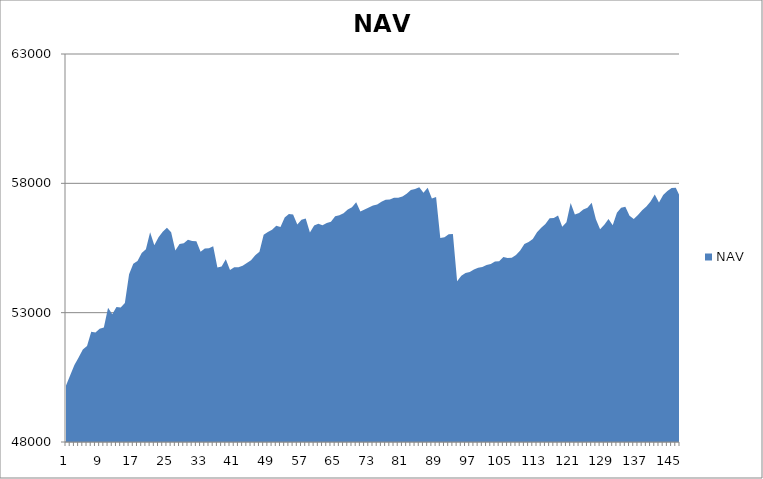
| Category | NAV |
|---|---|
| 0 | 50185.185 |
| 1 | 50585.185 |
| 2 | 50973.977 |
| 3 | 51265.977 |
| 4 | 51576.741 |
| 5 | 51711.523 |
| 6 | 52262.893 |
| 7 | 52230.24 |
| 8 | 52381.556 |
| 9 | 52425.915 |
| 10 | 53192.581 |
| 11 | 52939.146 |
| 12 | 53220.069 |
| 13 | 53197.341 |
| 14 | 53369.61 |
| 15 | 54480.721 |
| 16 | 54888.365 |
| 17 | 55001.902 |
| 18 | 55308.308 |
| 19 | 55448.308 |
| 20 | 56110.305 |
| 21 | 55610.305 |
| 22 | 55916.954 |
| 23 | 56129.798 |
| 24 | 56279.798 |
| 25 | 56105.301 |
| 26 | 55401.645 |
| 27 | 55657.201 |
| 28 | 55686.925 |
| 29 | 55823.001 |
| 30 | 55769.596 |
| 31 | 55759.375 |
| 32 | 55350.284 |
| 33 | 55480.284 |
| 34 | 55492.498 |
| 35 | 55570.42 |
| 36 | 54746.89 |
| 37 | 54783.7 |
| 38 | 55066.459 |
| 39 | 54651.074 |
| 40 | 54754.078 |
| 41 | 54760.213 |
| 42 | 54816.924 |
| 43 | 54917.296 |
| 44 | 55025.73 |
| 45 | 55220.535 |
| 46 | 55353.465 |
| 47 | 56009.309 |
| 48 | 56118.959 |
| 49 | 56205.212 |
| 50 | 56362.876 |
| 51 | 56307.394 |
| 52 | 56678.935 |
| 53 | 56813.264 |
| 54 | 56799.502 |
| 55 | 56409.112 |
| 56 | 56596.44 |
| 57 | 56640.493 |
| 58 | 56102.227 |
| 59 | 56370.449 |
| 60 | 56434.248 |
| 61 | 56376.841 |
| 62 | 56464.524 |
| 63 | 56518.022 |
| 64 | 56724.747 |
| 65 | 56770.361 |
| 66 | 56848.099 |
| 67 | 56992.896 |
| 68 | 57073.571 |
| 69 | 57266.481 |
| 70 | 56908.016 |
| 71 | 56984.939 |
| 72 | 57069.276 |
| 73 | 57147.627 |
| 74 | 57179.83 |
| 75 | 57291.17 |
| 76 | 57366.35 |
| 77 | 57371.599 |
| 78 | 57439.215 |
| 79 | 57440.895 |
| 80 | 57490.895 |
| 81 | 57593.679 |
| 82 | 57746.643 |
| 83 | 57785.413 |
| 84 | 57849.748 |
| 85 | 57639.346 |
| 86 | 57828.82 |
| 87 | 57417.055 |
| 88 | 57471.335 |
| 89 | 55888.376 |
| 90 | 55913.907 |
| 91 | 56031.989 |
| 92 | 56044.711 |
| 93 | 54210.631 |
| 94 | 54422.612 |
| 95 | 54536.647 |
| 96 | 54575.903 |
| 97 | 54670.229 |
| 98 | 54737.367 |
| 99 | 54762.386 |
| 100 | 54842.923 |
| 101 | 54881.385 |
| 102 | 54978.816 |
| 103 | 54991.283 |
| 104 | 55149.699 |
| 105 | 55109.498 |
| 106 | 55121.656 |
| 107 | 55227.569 |
| 108 | 55405.15 |
| 109 | 55650.183 |
| 110 | 55733.424 |
| 111 | 55846.244 |
| 112 | 56110.95 |
| 113 | 56283.172 |
| 114 | 56430.541 |
| 115 | 56648.489 |
| 116 | 56663.919 |
| 117 | 56752.272 |
| 118 | 56318.108 |
| 119 | 56496.442 |
| 120 | 57240.145 |
| 121 | 56797.081 |
| 122 | 56857.303 |
| 123 | 56985.874 |
| 124 | 57053.805 |
| 125 | 57249.117 |
| 126 | 56612.311 |
| 127 | 56221.507 |
| 128 | 56394.346 |
| 129 | 56622.008 |
| 130 | 56375.255 |
| 131 | 56862.384 |
| 132 | 57060.137 |
| 133 | 57099.524 |
| 134 | 56750.37 |
| 135 | 56622.71 |
| 136 | 56780.605 |
| 137 | 56961.84 |
| 138 | 57105.4 |
| 139 | 57301.96 |
| 140 | 57570.545 |
| 141 | 57256.886 |
| 142 | 57545.679 |
| 143 | 57705.679 |
| 144 | 57817.679 |
| 145 | 57831.595 |
| 146 | 57485.441 |